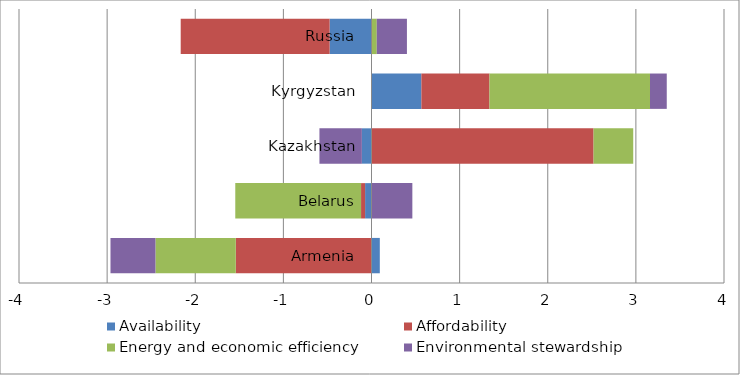
| Category | Availability | Affordability | Energy and economic efficiency | Environmental stewardship |
|---|---|---|---|---|
| Armenia | 0.094 | -1.54 | -0.912 | -0.51 |
| Belarus | -0.073 | -0.046 | -1.427 | 0.464 |
| Kazakhstan | -0.109 | 2.52 | 0.45 | -0.481 |
| Kyrgyzstan | 0.566 | 0.773 | 1.822 | 0.19 |
| Russia | -0.475 | -1.69 | 0.06 | 0.342 |